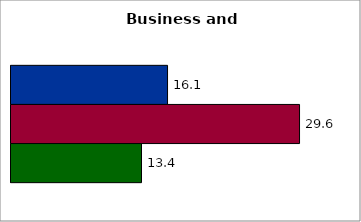
| Category | 50 states and D.C. | SREB states | State |
|---|---|---|---|
| 0 | 16.068 | 29.616 | 13.396 |